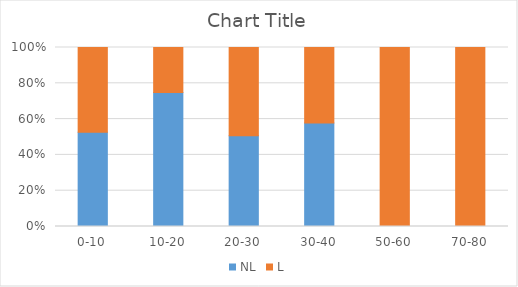
| Category | NL | L |
|---|---|---|
| 0-10 | 0.481 | 0.432 |
| 10-20 | 0.481 | 0.162 |
| 20-30 | 0.222 | 0.216 |
| 30-40 | 0.037 | 0.027 |
| 50-60 | 0 | 0.027 |
| 70-80 | 0 | 0.027 |